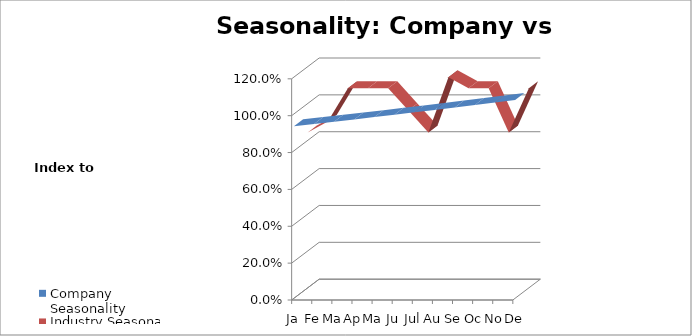
| Category | Company Seasonality | Industry Seasonality |
|---|---|---|
| Jan | 0.931 | 0.84 |
| Feb | 0.943 | 0.9 |
| Mar | 0.955 | 1.08 |
| Apr | 0.967 | 1.08 |
| May | 0.98 | 1.08 |
| Jun | 0.993 | 0.96 |
| Jul | 1.005 | 0.84 |
| Aug | 1.019 | 1.14 |
| Sep | 1.032 | 1.08 |
| Oct | 1.045 | 1.08 |
| Nov | 1.059 | 0.84 |
| Dec | 1.073 | 1.08 |